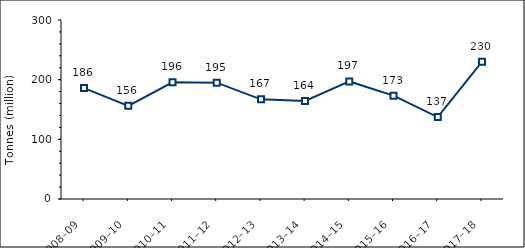
| Category | Total glass |
|---|---|
| 2008–09 | 185920 |
| 2009–10 | 156135.26 |
| 2010–11 | 195545 |
| 2011–12 | 195028 |
| 2012–13 | 166994 |
| 2013–14 | 164354 |
| 2014–15 | 197026 |
| 2015–16 | 173189 |
| 2016–17 | 137318 |
| 2017–18 | 229997 |